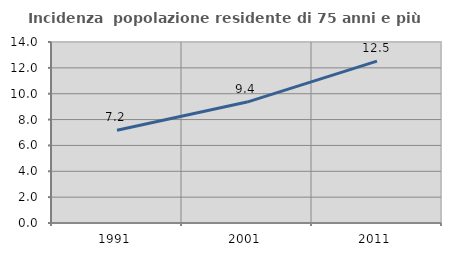
| Category | Incidenza  popolazione residente di 75 anni e più |
|---|---|
| 1991.0 | 7.176 |
| 2001.0 | 9.354 |
| 2011.0 | 12.517 |